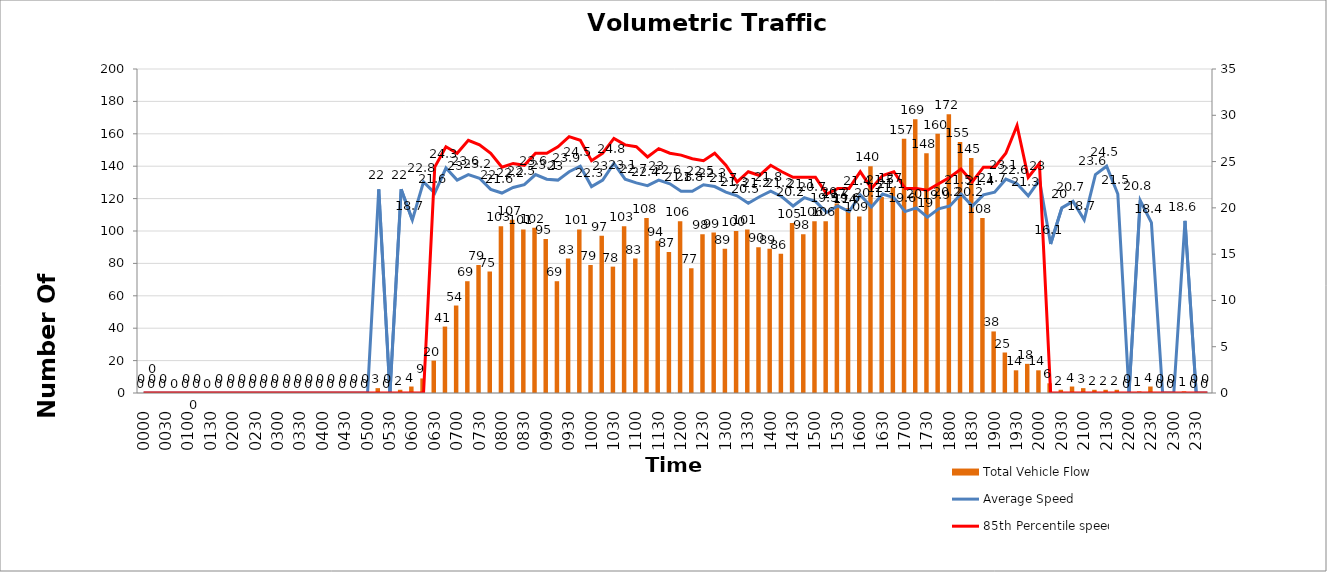
| Category | Total Vehicle Flow |
|---|---|
| 0000 | 0 |
| 0015 | 0 |
| 0030 | 0 |
| 0045 | 0 |
| 0100 | 0 |
| 0115 | 0 |
| 0130 | 0 |
| 0145 | 0 |
| 0200 | 0 |
| 0215 | 0 |
| 0230 | 0 |
| 0245 | 0 |
| 0300 | 0 |
| 0315 | 0 |
| 0330 | 0 |
| 0345 | 0 |
| 0400 | 0 |
| 0415 | 0 |
| 0430 | 0 |
| 0445 | 0 |
| 0500 | 0 |
| 0515 | 3 |
| 0530 | 0 |
| 0545 | 2 |
| 0600 | 4 |
| 0615 | 9 |
| 0630 | 20 |
| 0645 | 41 |
| 0700 | 54 |
| 0715 | 69 |
| 0730 | 79 |
| 0745 | 75 |
| 0800 | 103 |
| 0815 | 107 |
| 0830 | 101 |
| 0845 | 102 |
| 0900 | 95 |
| 0915 | 69 |
| 0930 | 83 |
| 0945 | 101 |
| 1000 | 79 |
| 1015 | 97 |
| 1030 | 78 |
| 1045 | 103 |
| 1100 | 83 |
| 1115 | 108 |
| 1130 | 94 |
| 1145 | 87 |
| 1200 | 106 |
| 1215 | 77 |
| 1230 | 98 |
| 1245 | 99 |
| 1300 | 89 |
| 1315 | 100 |
| 1330 | 101 |
| 1345 | 90 |
| 1400 | 89 |
| 1415 | 86 |
| 1430 | 105 |
| 1445 | 98 |
| 1500 | 106 |
| 1515 | 106 |
| 1530 | 117 |
| 1545 | 114 |
| 1600 | 109 |
| 1615 | 140 |
| 1630 | 121 |
| 1645 | 127 |
| 1700 | 157 |
| 1715 | 169 |
| 1730 | 148 |
| 1745 | 160 |
| 1800 | 172 |
| 1815 | 155 |
| 1830 | 145 |
| 1845 | 108 |
| 1900 | 38 |
| 1915 | 25 |
| 1930 | 14 |
| 1945 | 18 |
| 2000 | 14 |
| 2015 | 6 |
| 2030 | 2 |
| 2045 | 4 |
| 2100 | 3 |
| 2115 | 2 |
| 2130 | 2 |
| 2145 | 2 |
| 2200 | 0 |
| 2215 | 1 |
| 2230 | 4 |
| 2245 | 0 |
| 2300 | 0 |
| 2315 | 1 |
| 2330 | 0 |
| 2345 | 0 |